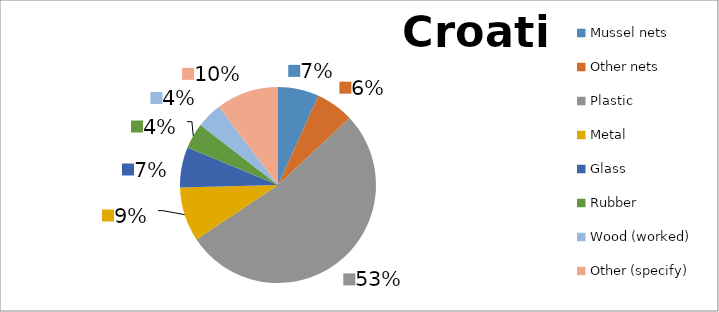
| Category | Croatia |
|---|---|
| Mussel nets | 470.2 |
| Other nets | 434.7 |
| Plastic | 3652.5 |
| Metal | 621.3 |
| Glass | 464 |
| Rubber | 292.7 |
| Wood (worked) | 294 |
| Other (specify) | 713.9 |